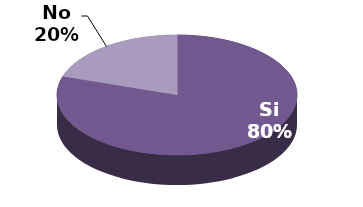
| Category | Series 1 |
|---|---|
| Si | 8 |
| No | 2 |